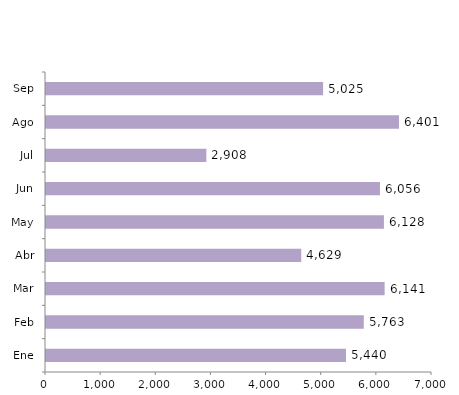
| Category | Series 0 |
|---|---|
| Ene | 5440 |
| Feb | 5763 |
| Mar | 6141 |
| Abr | 4629 |
| May | 6128 |
| Jun | 6056 |
| Jul | 2908 |
| Ago | 6401 |
| Sep | 5025 |